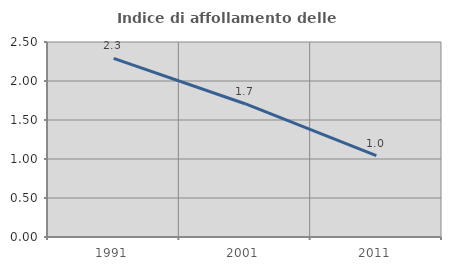
| Category | Indice di affollamento delle abitazioni  |
|---|---|
| 1991.0 | 2.289 |
| 2001.0 | 1.709 |
| 2011.0 | 1.045 |